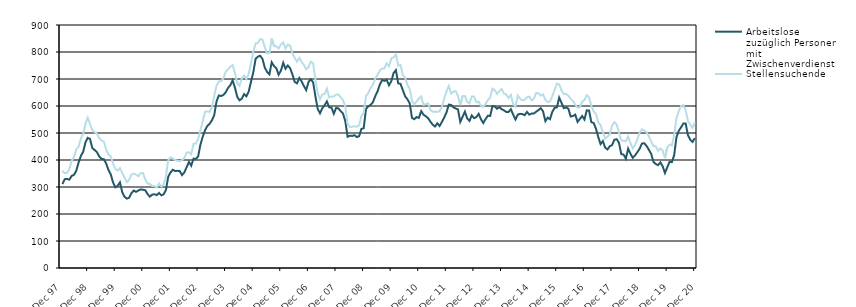
| Category | Arbeitslose zuzüglich Personen mit Zwischenverdienst | Stellensuchende |
|---|---|---|
| 1998-01-01 | 311 | 360 |
| 1998-02-01 | 329 | 351 |
| 1998-03-01 | 330 | 353 |
| 1998-04-01 | 327 | 366 |
| 1998-05-01 | 341 | 398 |
| 1998-06-01 | 345 | 410 |
| 1998-07-01 | 360 | 439 |
| 1998-08-01 | 390 | 449 |
| 1998-09-01 | 415 | 479 |
| 1998-10-01 | 430 | 496 |
| 1998-11-01 | 465 | 535 |
| 1998-12-01 | 482 | 557 |
| 1999-01-01 | 478 | 533 |
| 1999-02-01 | 444 | 510 |
| 1999-03-01 | 437 | 503 |
| 1999-04-01 | 429 | 498 |
| 1999-05-01 | 413 | 481 |
| 1999-06-01 | 404 | 472 |
| 1999-07-01 | 403 | 468 |
| 1999-08-01 | 387 | 439 |
| 1999-09-01 | 363 | 420 |
| 1999-10-01 | 347 | 413 |
| 1999-11-01 | 317 | 387 |
| 1999-12-01 | 299 | 367 |
| 2000-01-01 | 304 | 361 |
| 2000-02-01 | 317 | 370 |
| 2000-03-01 | 281 | 352 |
| 2000-04-01 | 264 | 335 |
| 2000-05-01 | 257 | 318 |
| 2000-06-01 | 260 | 327 |
| 2000-07-01 | 277 | 346 |
| 2000-08-01 | 287 | 349 |
| 2000-09-01 | 282 | 346 |
| 2000-10-01 | 287 | 340 |
| 2000-11-01 | 291 | 351 |
| 2000-12-01 | 290 | 352 |
| 2001-01-01 | 288 | 328 |
| 2001-02-01 | 274 | 313 |
| 2001-03-01 | 264 | 311 |
| 2001-04-01 | 272 | 304 |
| 2001-05-01 | 273 | 304 |
| 2001-06-01 | 270 | 298 |
| 2001-07-01 | 278 | 313 |
| 2001-08-01 | 269 | 302 |
| 2001-09-01 | 273 | 307 |
| 2001-10-01 | 289 | 340 |
| 2001-11-01 | 338 | 399 |
| 2001-12-01 | 354 | 410 |
| 2002-01-01 | 364 | 405 |
| 2002-02-01 | 359 | 400 |
| 2002-03-01 | 360 | 397 |
| 2002-04-01 | 359 | 396 |
| 2002-05-01 | 344 | 399 |
| 2002-06-01 | 354 | 408 |
| 2002-07-01 | 373 | 427 |
| 2002-08-01 | 393 | 429 |
| 2002-09-01 | 379 | 421 |
| 2002-10-01 | 405 | 460 |
| 2002-11-01 | 404 | 461 |
| 2002-12-01 | 413 | 477 |
| 2003-01-01 | 457 | 511 |
| 2003-02-01 | 486 | 543 |
| 2003-03-01 | 510 | 578 |
| 2003-04-01 | 526 | 580 |
| 2003-05-01 | 534 | 578 |
| 2003-06-01 | 547 | 595 |
| 2003-07-01 | 566 | 638 |
| 2003-08-01 | 617 | 675 |
| 2003-09-01 | 639 | 691 |
| 2003-10-01 | 637 | 692 |
| 2003-11-01 | 641 | 703 |
| 2003-12-01 | 651 | 727 |
| 2004-01-01 | 667 | 736 |
| 2004-02-01 | 677 | 746 |
| 2004-03-01 | 695 | 751 |
| 2004-04-01 | 668 | 723 |
| 2004-05-01 | 634 | 684 |
| 2004-06-01 | 621 | 675 |
| 2004-07-01 | 627 | 703 |
| 2004-08-01 | 644 | 713 |
| 2004-09-01 | 636 | 700 |
| 2004-10-01 | 654 | 719 |
| 2004-11-01 | 690 | 760 |
| 2004-12-01 | 725 | 802 |
| 2005-01-01 | 775 | 831 |
| 2005-02-01 | 783 | 834 |
| 2005-03-01 | 786 | 848 |
| 2005-04-01 | 774 | 846 |
| 2005-05-01 | 742 | 817 |
| 2005-06-01 | 726 | 795 |
| 2005-07-01 | 717 | 796 |
| 2005-08-01 | 762 | 850 |
| 2005-09-01 | 748 | 822 |
| 2005-10-01 | 740 | 821 |
| 2005-11-01 | 716 | 813 |
| 2005-12-01 | 731 | 828 |
| 2006-01-01 | 760 | 836 |
| 2006-02-01 | 738 | 813 |
| 2006-03-01 | 750 | 828 |
| 2006-04-01 | 740 | 823 |
| 2006-05-01 | 717 | 796 |
| 2006-06-01 | 689 | 778 |
| 2006-07-01 | 684 | 764 |
| 2006-08-01 | 704 | 778 |
| 2006-09-01 | 691 | 763 |
| 2006-10-01 | 674 | 752 |
| 2006-11-01 | 659 | 736 |
| 2006-12-01 | 689 | 744 |
| 2007-01-01 | 699 | 764 |
| 2007-02-01 | 688 | 759 |
| 2007-03-01 | 636 | 697 |
| 2007-04-01 | 589 | 648 |
| 2007-05-01 | 573 | 625 |
| 2007-06-01 | 592 | 643 |
| 2007-07-01 | 603 | 644 |
| 2007-08-01 | 617 | 664 |
| 2007-09-01 | 595 | 632 |
| 2007-10-01 | 594 | 635 |
| 2007-11-01 | 571 | 636 |
| 2007-12-01 | 593 | 642 |
| 2008-01-01 | 591 | 643 |
| 2008-02-01 | 581 | 632 |
| 2008-03-01 | 572 | 622 |
| 2008-04-01 | 544 | 598 |
| 2008-05-01 | 486 | 534 |
| 2008-06-01 | 490 | 522 |
| 2008-07-01 | 489 | 523 |
| 2008-08-01 | 492 | 525 |
| 2008-09-01 | 485 | 523 |
| 2008-10-01 | 488 | 529 |
| 2008-11-01 | 515 | 563 |
| 2008-12-01 | 518 | 574 |
| 2009-01-01 | 589 | 637 |
| 2009-02-01 | 599 | 648 |
| 2009-03-01 | 604 | 667 |
| 2009-04-01 | 614 | 678 |
| 2009-05-01 | 636 | 701 |
| 2009-06-01 | 654 | 715 |
| 2009-07-01 | 679 | 731 |
| 2009-08-01 | 696 | 739 |
| 2009-09-01 | 693 | 739 |
| 2009-10-01 | 697 | 758 |
| 2009-11-01 | 677 | 747 |
| 2009-12-01 | 692 | 776 |
| 2010-01-01 | 722 | 780 |
| 2010-02-01 | 733 | 791 |
| 2010-03-01 | 684 | 749 |
| 2010-04-01 | 682 | 752 |
| 2010-05-01 | 659 | 715 |
| 2010-06-01 | 636 | 705 |
| 2010-07-01 | 625 | 679 |
| 2010-08-01 | 610 | 664 |
| 2010-09-01 | 556 | 620 |
| 2010-10-01 | 551 | 606 |
| 2010-11-01 | 559 | 617 |
| 2010-12-01 | 556 | 628 |
| 2011-01-01 | 581 | 635 |
| 2011-02-01 | 568 | 604 |
| 2011-03-01 | 562 | 607 |
| 2011-04-01 | 555 | 610 |
| 2011-05-01 | 542 | 585 |
| 2011-06-01 | 531 | 579 |
| 2011-07-01 | 524 | 579 |
| 2011-08-01 | 536 | 578 |
| 2011-09-01 | 526 | 581 |
| 2011-10-01 | 541 | 596 |
| 2011-11-01 | 557 | 628 |
| 2011-12-01 | 576 | 654 |
| 2012-01-01 | 605 | 674 |
| 2012-02-01 | 604 | 646 |
| 2012-03-01 | 595 | 653 |
| 2012-04-01 | 591 | 655 |
| 2012-05-01 | 587 | 637 |
| 2012-06-01 | 541 | 603 |
| 2012-07-01 | 560 | 637 |
| 2012-08-01 | 579 | 637 |
| 2012-09-01 | 554 | 615 |
| 2012-10-01 | 545 | 610 |
| 2012-11-01 | 565 | 635 |
| 2012-12-01 | 555 | 635 |
| 2013-01-01 | 559 | 614 |
| 2013-02-01 | 571 | 616 |
| 2013-03-01 | 551 | 600 |
| 2013-04-01 | 537 | 597 |
| 2013-05-01 | 552 | 608 |
| 2013-06-01 | 564 | 622 |
| 2013-07-01 | 563 | 631 |
| 2013-08-01 | 600 | 664 |
| 2013-09-01 | 598 | 658 |
| 2013-10-01 | 590 | 645 |
| 2013-11-01 | 596 | 655 |
| 2013-12-01 | 588 | 663 |
| 2014-01-01 | 584 | 646 |
| 2014-02-01 | 578 | 643 |
| 2014-03-01 | 578 | 629 |
| 2014-04-01 | 588 | 641 |
| 2014-05-01 | 568 | 607 |
| 2014-06-01 | 550 | 598 |
| 2014-07-01 | 568 | 639 |
| 2014-08-01 | 571 | 627 |
| 2014-09-01 | 570 | 621 |
| 2014-10-01 | 566 | 623 |
| 2014-11-01 | 578 | 632 |
| 2014-12-01 | 568 | 635 |
| 2015-01-01 | 572 | 621 |
| 2015-02-01 | 572 | 627 |
| 2015-03-01 | 579 | 648 |
| 2015-04-01 | 585 | 647 |
| 2015-05-01 | 592 | 638 |
| 2015-06-01 | 580 | 643 |
| 2015-07-01 | 544 | 623 |
| 2015-08-01 | 557 | 614 |
| 2015-09-01 | 551 | 617 |
| 2015-10-01 | 578 | 636 |
| 2015-11-01 | 593 | 659 |
| 2015-12-01 | 595 | 683 |
| 2016-01-01 | 631 | 680 |
| 2016-02-01 | 612 | 658 |
| 2016-03-01 | 592 | 644 |
| 2016-04-01 | 595 | 645 |
| 2016-05-01 | 590 | 638 |
| 2016-06-01 | 561 | 626 |
| 2016-07-01 | 563 | 619 |
| 2016-08-01 | 568 | 605 |
| 2016-09-01 | 541 | 594 |
| 2016-10-01 | 552 | 595 |
| 2016-11-01 | 563 | 616 |
| 2016-12-01 | 550 | 622 |
| 2017-01-01 | 584 | 640 |
| 2017-02-01 | 583 | 632 |
| 2017-03-01 | 540 | 600 |
| 2017-04-01 | 537 | 580 |
| 2017-05-01 | 516 | 570 |
| 2017-06-01 | 485 | 540 |
| 2017-07-01 | 459 | 529 |
| 2017-08-01 | 470 | 503 |
| 2017-09-01 | 446 | 479 |
| 2017-10-01 | 439 | 486 |
| 2017-11-01 | 451 | 495 |
| 2017-12-01 | 455 | 527 |
| 2018-01-01 | 475 | 540 |
| 2018-02-01 | 477 | 532 |
| 2018-03-01 | 464 | 500 |
| 2018-04-01 | 422 | 473 |
| 2018-05-01 | 420 | 471 |
| 2018-06-01 | 405 | 470 |
| 2018-07-01 | 442 | 487 |
| 2018-08-01 | 423 | 462 |
| 2018-09-01 | 408 | 443 |
| 2018-10-01 | 417 | 455 |
| 2018-11-01 | 429 | 476 |
| 2018-12-01 | 442 | 502 |
| 2019-01-01 | 461 | 514 |
| 2019-02-01 | 462 | 509 |
| 2019-03-01 | 452 | 503 |
| 2019-04-01 | 438 | 487 |
| 2019-05-01 | 423 | 469 |
| 2019-06-01 | 393 | 451 |
| 2019-07-01 | 385 | 451 |
| 2019-08-01 | 381 | 433 |
| 2019-09-01 | 391 | 443 |
| 2019-10-01 | 377 | 435 |
| 2019-11-01 | 352 | 407 |
| 2019-12-01 | 373 | 446 |
| 2020-01-01 | 393 | 457 |
| 2020-02-01 | 392 | 454 |
| 2020-03-01 | 418 | 492 |
| 2020-04-01 | 484 | 555 |
| 2020-05-01 | 508 | 581 |
| 2020-06-01 | 521 | 600 |
| 2020-07-01 | 535 | 603 |
| 2020-08-01 | 535 | 584 |
| 2020-09-01 | 492 | 545 |
| 2020-10-01 | 475 | 531 |
| 2020-11-01 | 467 | 519 |
| 2020-12-01 | 481 | 539 |